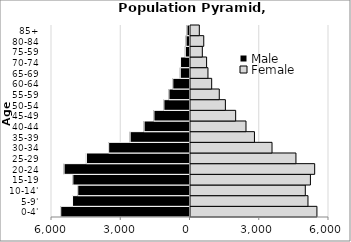
| Category | Male | Female |
|---|---|---|
| 0-4' | -5600.31 | 5476.95 |
| 5-9' | -5088.4 | 5089.57 |
| 10-14' | -4862.33 | 4973.31 |
| 15-19 | -5075.21 | 5194.97 |
| 20-24 | -5454.56 | 5379.89 |
| 25-29 | -4487.14 | 4568.22 |
| 30-34 | -3523.48 | 3531.6 |
| 35-39 | -2591.97 | 2769.98 |
| 40-44 | -1988.22 | 2404.02 |
| 45-49 | -1562.23 | 1956.62 |
| 50-54 | -1130.54 | 1511.23 |
| 55-59 | -912.01 | 1246.54 |
| 60-64 | -744.31 | 917.83 |
| 65-69 | -420.5 | 756.5 |
| 70-74 | -409.87 | 697.44 |
| 75-59 | -202.85 | 512.26 |
| 80-84 | -170.55 | 574.49 |
| 85+ | -129.46 | 381.91 |